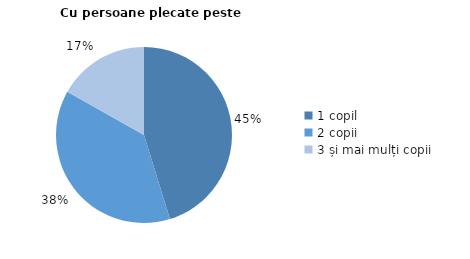
| Category | Cu migranți |
|---|---|
| 1 copil | 45.242 |
| 2 copii | 37.92 |
| 3 și mai mulți copii | 16.838 |